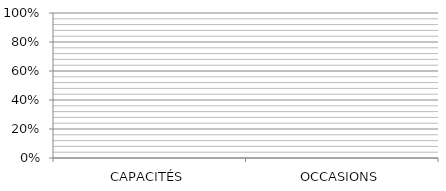
| Category | Series 0 | Series 1 | Series 2 | Series 3 | Series 4 | Series 5 | Series 6 | Series 7 |
|---|---|---|---|---|---|---|---|---|
| CAPACITÉS | 0 | 0 | 0 | 0 | 0 | 0 | 0 | 0 |
| OCCASIONS | 0 | 0 | 0 | 0 | 0 | 0 | 0 | 0 |